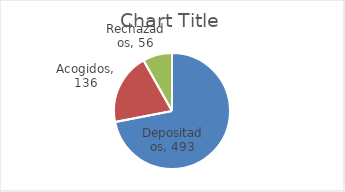
| Category | Series 0 |
|---|---|
| Depositados | 493 |
| Acogidos | 136 |
| Rechazados | 56 |